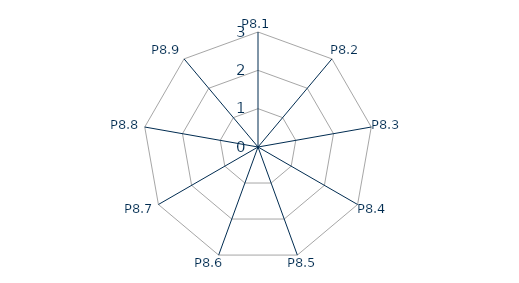
| Category | E08 |
|---|---|
| P8.1 | 0 |
| P8.2 | 0 |
| P8.3 | 0 |
| P8.4 | 0 |
| P8.5 | 0 |
| P8.6 | 0 |
| P8.7 | 0 |
| P8.8 | 0 |
| P8.9 | 0 |